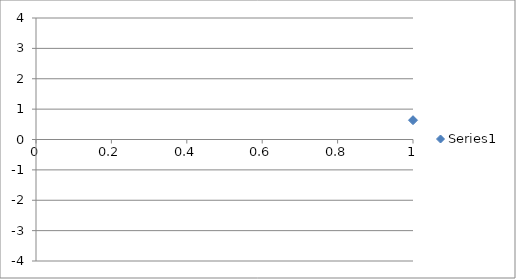
| Category | Series 0 |
|---|---|
| 0 | 0.636 |
| 1 | 1.004 |
| 2 | 1.754 |
| 3 | 1.162 |
| 4 | 0.38 |
| 5 | 0.19 |
| 6 | 0.744 |
| 7 | 0.642 |
| 8 | 0.556 |
| 9 | -1.528 |
| 10 | 0.773 |
| 11 | 0.345 |
| 12 | -0.09 |
| 13 | -1.63 |
| 14 | -0.12 |
| 15 | 1.317 |
| 16 | -0.302 |
| 17 | -0.511 |
| 18 | -0.824 |
| 19 | 0.758 |
| 20 | -1.618 |
| 21 | -1.153 |
| 22 | -0.097 |
| 23 | -0.929 |
| 24 | -1.388 |
| 25 | 0.124 |
| 26 | 0.292 |
| 27 | -0.352 |
| 28 | -0.188 |
| 29 | 0.951 |
| 30 | -0.192 |
| 31 | -0.151 |
| 32 | -0.055 |
| 33 | -0.922 |
| 34 | -0.14 |
| 35 | 0.74 |
| 36 | 0.985 |
| 37 | -0.102 |
| 38 | 1.831 |
| 39 | 2.6 |
| 40 | -1.301 |
| 41 | 1.106 |
| 42 | 1.1 |
| 43 | -0.743 |
| 44 | -0.687 |
| 45 | 1.255 |
| 46 | -0.95 |
| 47 | 0.716 |
| 48 | -0.32 |
| 49 | -0.008 |
| 50 | -0.055 |
| 51 | 1.253 |
| 52 | -1.075 |
| 53 | 0.085 |
| 54 | 1.781 |
| 55 | 0.334 |
| 56 | 1.335 |
| 57 | -0.453 |
| 58 | 1.046 |
| 59 | 1.041 |
| 60 | -1.469 |
| 61 | -1.563 |
| 62 | -1.487 |
| 63 | -0.041 |
| 64 | -1.183 |
| 65 | 0.853 |
| 66 | 0.687 |
| 67 | 1.001 |
| 68 | 2.039 |
| 69 | 0.221 |
| 70 | -0.11 |
| 71 | -0.748 |
| 72 | -0.691 |
| 73 | 0.623 |
| 74 | -0.919 |
| 75 | 0.859 |
| 76 | -1.227 |
| 77 | -1.481 |
| 78 | -0.417 |
| 79 | -0.263 |
| 80 | -1.396 |
| 81 | 0.132 |
| 82 | -0.255 |
| 83 | -1.609 |
| 84 | 0.15 |
| 85 | 0.907 |
| 86 | 0.197 |
| 87 | -1.43 |
| 88 | 0.295 |
| 89 | -0.295 |
| 90 | 0.592 |
| 91 | 0.621 |
| 92 | 1.332 |
| 93 | -0.735 |
| 94 | -0.095 |
| 95 | 0.132 |
| 96 | -0.966 |
| 97 | -1.987 |
| 98 | -1.743 |
| 99 | 1.02 |
| 100 | -1.786 |
| 101 | 0.338 |
| 102 | -0.488 |
| 103 | 0.171 |
| 104 | 0.37 |
| 105 | -0.263 |
| 106 | -0.118 |
| 107 | -1.39 |
| 108 | 1.619 |
| 109 | -1.267 |
| 110 | 0.516 |
| 111 | 0.038 |
| 112 | 0.138 |
| 113 | 0.534 |
| 114 | 1.021 |
| 115 | 1.615 |
| 116 | -0.571 |
| 117 | 0.055 |
| 118 | 1.013 |
| 119 | -1.171 |
| 120 | 2.258 |
| 121 | 0.608 |
| 122 | 0.284 |
| 123 | -0.651 |
| 124 | 0.113 |
| 125 | -1.273 |
| 126 | 0.331 |
| 127 | -0.769 |
| 128 | 0.218 |
| 129 | -0.839 |
| 130 | -2.6 |
| 131 | 1.495 |
| 132 | 1.664 |
| 133 | 1.42 |
| 134 | -2.346 |
| 135 | 2.022 |
| 136 | 0.514 |
| 137 | -1.801 |
| 138 | -0.22 |
| 139 | -1.171 |
| 140 | -2.464 |
| 141 | 0.643 |
| 142 | -1.412 |
| 143 | -0.602 |
| 144 | -0.132 |
| 145 | -0.176 |
| 146 | -1.171 |
| 147 | -2.078 |
| 148 | 1.425 |
| 149 | 0.823 |
| 150 | -0.168 |
| 151 | -0.37 |
| 152 | 0.514 |
| 153 | 0.623 |
| 154 | -0.508 |
| 155 | 1.054 |
| 156 | -1.273 |
| 157 | -0.816 |
| 158 | 2.498 |
| 159 | -1.097 |
| 160 | -0.382 |
| 161 | -0.391 |
| 162 | -0.734 |
| 163 | -0.191 |
| 164 | 0.071 |
| 165 | 0.16 |
| 166 | 1.787 |
| 167 | 0.031 |
| 168 | 0.01 |
| 169 | 1.586 |
| 170 | 1.677 |
| 171 | -2.298 |
| 172 | 0.529 |
| 173 | 0.052 |
| 174 | 0.661 |
| 175 | -0.114 |
| 176 | 2.003 |
| 177 | 1.588 |
| 178 | 2.389 |
| 179 | -0.483 |
| 180 | -0.35 |
| 181 | 1.161 |
| 182 | -1.422 |
| 183 | 0.794 |
| 184 | 1.311 |
| 185 | 0.668 |
| 186 | 0.13 |
| 187 | 1.175 |
| 188 | 0.527 |
| 189 | 0.395 |
| 190 | -0.325 |
| 191 | -2.051 |
| 192 | 0.967 |
| 193 | -0.158 |
| 194 | -1.124 |
| 195 | 0.899 |
| 196 | -2.179 |
| 197 | -0.427 |
| 198 | -0.76 |
| 199 | -0.748 |
| 200 | 0.466 |
| 201 | -1.677 |
| 202 | 0.28 |
| 203 | 1.351 |
| 204 | 1.813 |
| 205 | 0.981 |
| 206 | -0.238 |
| 207 | -0.477 |
| 208 | 1.499 |
| 209 | -2.084 |
| 210 | -0.81 |
| 211 | -0.631 |
| 212 | -0.935 |
| 213 | 0.399 |
| 214 | 0.593 |
| 215 | -0.768 |
| 216 | 1.464 |
| 217 | 0.864 |
| 218 | 0.46 |
| 219 | -1.216 |
| 220 | -0.871 |
| 221 | -1.001 |
| 222 | -0.981 |
| 223 | 0.219 |
| 224 | 0.718 |
| 225 | 0.72 |
| 226 | 0.767 |
| 227 | -1.277 |
| 228 | -0.524 |
| 229 | -1.149 |
| 230 | 0.254 |
| 231 | -0.725 |
| 232 | -1.225 |
| 233 | -0.191 |
| 234 | -0.658 |
| 235 | 2.303 |
| 236 | 1.016 |
| 237 | 0.725 |
| 238 | 0.884 |
| 239 | 0.383 |
| 240 | -0.843 |
| 241 | -0.511 |
| 242 | 1.061 |
| 243 | -1.405 |
| 244 | -0.489 |
| 245 | -2.108 |
| 246 | 1.776 |
| 247 | 0.545 |
| 248 | 0.215 |
| 249 | -1.826 |
| 250 | 1.623 |
| 251 | -0.181 |
| 252 | -1.742 |
| 253 | 0.225 |
| 254 | -0.684 |
| 255 | -0.558 |
| 256 | 0.657 |
| 257 | 0.295 |
| 258 | -3.498 |
| 259 | -0.484 |
| 260 | 1.65 |
| 261 | -1.843 |
| 262 | -0.39 |
| 263 | 1.313 |
| 264 | 0.255 |
| 265 | 0.62 |
| 266 | -0.535 |
| 267 | -1.008 |
| 268 | 0.234 |
| 269 | -0.999 |
| 270 | -1.965 |
| 271 | -0.904 |
| 272 | -1.455 |
| 273 | -0.423 |
| 274 | -0.92 |
| 275 | -1.669 |
| 276 | 0.528 |
| 277 | -1.024 |
| 278 | -0.737 |
| 279 | -0.082 |
| 280 | 0.236 |
| 281 | 0.435 |
| 282 | -0.113 |
| 283 | -1.369 |
| 284 | -1.853 |
| 285 | -0.391 |
| 286 | 1.927 |
| 287 | 0.558 |
| 288 | 0.398 |
| 289 | 0.492 |
| 290 | 0.477 |
| 291 | 0.324 |
| 292 | -0.543 |
| 293 | 0.835 |
| 294 | -0.704 |
| 295 | 0.899 |
| 296 | 0.463 |
| 297 | -0.148 |
| 298 | -2.052 |
| 299 | 0.541 |
| 300 | 0.33 |
| 301 | -0.406 |
| 302 | 0.679 |
| 303 | 0.31 |
| 304 | -0.434 |
| 305 | 0.054 |
| 306 | -0.38 |
| 307 | 1.592 |
| 308 | -0.382 |
| 309 | -0.359 |
| 310 | 0.246 |
| 311 | 0.485 |
| 312 | 0.087 |
| 313 | 0.737 |
| 314 | -1.364 |
| 315 | -0.78 |
| 316 | 0.317 |
| 317 | -0.613 |
| 318 | 0.53 |
| 319 | 0.06 |
| 320 | 0.025 |
| 321 | 0.621 |
| 322 | -0.165 |
| 323 | 1.648 |
| 324 | -2.081 |
| 325 | -0.154 |
| 326 | -0.542 |
| 327 | -1.93 |
| 328 | -0.229 |
| 329 | 1.05 |
| 330 | -2.26 |
| 331 | -0.87 |
| 332 | 1.669 |
| 333 | 0.655 |
| 334 | -0.165 |
| 335 | -1.778 |
| 336 | 0.731 |
| 337 | -2.17 |
| 338 | 2.318 |
| 339 | 0.13 |
| 340 | -2.49 |
| 341 | 1.225 |
| 342 | 0.879 |
| 343 | -0.617 |
| 344 | -0.047 |
| 345 | -1.167 |
| 346 | -1.747 |
| 347 | 1.923 |
| 348 | 0.456 |
| 349 | -0.348 |
| 350 | 0.828 |
| 351 | 1.072 |
| 352 | -0.516 |
| 353 | -0.657 |
| 354 | -1 |
| 355 | -2.768 |
| 356 | -0.135 |
| 357 | 1.284 |
| 358 | 1.03 |
| 359 | -1.036 |
| 360 | 1.513 |
| 361 | 0.221 |
| 362 | -0.398 |
| 363 | -1.006 |
| 364 | -1.751 |
| 365 | 1.952 |
| 366 | -0.78 |
| 367 | -0.89 |
| 368 | 0.203 |
| 369 | -0.065 |
| 370 | -0.365 |
| 371 | 0.533 |
| 372 | -0.071 |
| 373 | 1.216 |
| 374 | 0.547 |
| 375 | -0.631 |
| 376 | -2.058 |
| 377 | -0.34 |
| 378 | -0.256 |
| 379 | 1.099 |
| 380 | 2.069 |
| 381 | 0.585 |
| 382 | 0.456 |
| 383 | -0.649 |
| 384 | -2.37 |
| 385 | -0.732 |
| 386 | 1.275 |
| 387 | 0.384 |
| 388 | 0.193 |
| 389 | 1.289 |
| 390 | -0.119 |
| 391 | -0.206 |
| 392 | 0.802 |
| 393 | -0.787 |
| 394 | 0.753 |
| 395 | 0.943 |
| 396 | -0.707 |
| 397 | 0.627 |
| 398 | 0.973 |
| 399 | 0.491 |
| 400 | -0.893 |
| 401 | -0.241 |
| 402 | 1.309 |
| 403 | -0.139 |
| 404 | -1.401 |
| 405 | -0.517 |
| 406 | 0.183 |
| 407 | -0.039 |
| 408 | -0.446 |
| 409 | -1.891 |
| 410 | 0.854 |
| 411 | 0.813 |
| 412 | 0.415 |
| 413 | -0.11 |
| 414 | -0.516 |
| 415 | -0.27 |
| 416 | -0.905 |
| 417 | 1.341 |
| 418 | -1.512 |
| 419 | 0.622 |
| 420 | 0.627 |
| 421 | 1.223 |
| 422 | 0.907 |
| 423 | -0.131 |
| 424 | -1.139 |
| 425 | 0.099 |
| 426 | 0.542 |
| 427 | -0.982 |
| 428 | 1.253 |
| 429 | 0.701 |
| 430 | -0.22 |
| 431 | -0.928 |
| 432 | 0.278 |
| 433 | -0.487 |
| 434 | 0.085 |
| 435 | -2.616 |
| 436 | -0.75 |
| 437 | 1.967 |
| 438 | -0.952 |
| 439 | -0.325 |
| 440 | 0.474 |
| 441 | 0.99 |
| 442 | -0.541 |
| 443 | -1.412 |
| 444 | 2.036 |
| 445 | -0.674 |
| 446 | 1.059 |
| 447 | 0.716 |
| 448 | -1.067 |
| 449 | 1.237 |
| 450 | -0.809 |
| 451 | -0.49 |
| 452 | 1.066 |
| 453 | 0.431 |
| 454 | 0.065 |
| 455 | -0.075 |
| 456 | 0.995 |
| 457 | -0.228 |
| 458 | -0.848 |
| 459 | 1.333 |
| 460 | -0.368 |
| 461 | 0.501 |
| 462 | -0.442 |
| 463 | 0.112 |
| 464 | -1.488 |
| 465 | -0.365 |
| 466 | 1.268 |
| 467 | 0.272 |
| 468 | 0.771 |
| 469 | 1.018 |
| 470 | -0.285 |
| 471 | 0.263 |
| 472 | 1.426 |
| 473 | 0.084 |
| 474 | 1.622 |
| 475 | -0.054 |
| 476 | 0.402 |
| 477 | 0.439 |
| 478 | -1.168 |
| 479 | 0.576 |
| 480 | -0.02 |
| 481 | -0.869 |
| 482 | -0.166 |
| 483 | -0.809 |
| 484 | -0.666 |
| 485 | 0.743 |
| 486 | -1.605 |
| 487 | -0.902 |
| 488 | -0.546 |
| 489 | 2.044 |
| 490 | 0.224 |
| 491 | -0.33 |
| 492 | 0.028 |
| 493 | -1.039 |
| 494 | 0.616 |
| 495 | -0.687 |
| 496 | 1.159 |
| 497 | -1.69 |
| 498 | 0.258 |
| 499 | -1.38 |
| 500 | -1.994 |
| 501 | -1.224 |
| 502 | -0.116 |
| 503 | -0.716 |
| 504 | 0.583 |
| 505 | 0.325 |
| 506 | -0.929 |
| 507 | -2.248 |
| 508 | -1.448 |
| 509 | -1.368 |
| 510 | 0.075 |
| 511 | 0.496 |
| 512 | 0.481 |
| 513 | 1.391 |
| 514 | 0.625 |
| 515 | 1.103 |
| 516 | -1.241 |
| 517 | -0.045 |
| 518 | 0.549 |
| 519 | -1.495 |
| 520 | 0.644 |
| 521 | 0.647 |
| 522 | 0.614 |
| 523 | -0.272 |
| 524 | 0.443 |
| 525 | 0.211 |
| 526 | 0.356 |
| 527 | 0.717 |
| 528 | 1.743 |
| 529 | -0.383 |
| 530 | 0.328 |
| 531 | 0.878 |
| 532 | 0.16 |
| 533 | -1.504 |
| 534 | 0.661 |
| 535 | 1.058 |
| 536 | -0.026 |
| 537 | -0.866 |
| 538 | -1.189 |
| 539 | -0.161 |
| 540 | -0.072 |
| 541 | 0.586 |
| 542 | 0.259 |
| 543 | 2.102 |
| 544 | 1.284 |
| 545 | 0.49 |
| 546 | 1.962 |
| 547 | -0.149 |
| 548 | -1.301 |
| 549 | -0.831 |
| 550 | -0.2 |
| 551 | -0.371 |
| 552 | 0.109 |
| 553 | -0.982 |
| 554 | -1.414 |
| 555 | 0.976 |
| 556 | -2.493 |
| 557 | 0.378 |
| 558 | -0.347 |
| 559 | -2.13 |
| 560 | 1.235 |
| 561 | 0.214 |
| 562 | 0.428 |
| 563 | -1.183 |
| 564 | -0.481 |
| 565 | 1.105 |
| 566 | 0.628 |
| 567 | -0.022 |
| 568 | -0.749 |
| 569 | -0.471 |
| 570 | 0.025 |
| 571 | 1.253 |
| 572 | 0.123 |
| 573 | 0.259 |
| 574 | -1.26 |
| 575 | -0.106 |
| 576 | -0.214 |
| 577 | 0.717 |
| 578 | -1.052 |
| 579 | 0.013 |
| 580 | 0.791 |
| 581 | -0.551 |
| 582 | 0.451 |
| 583 | 0.059 |
| 584 | -0.634 |
| 585 | -0.768 |
| 586 | -1.561 |
| 587 | 0.221 |
| 588 | 1.126 |
| 589 | -1.222 |
| 590 | 1.598 |
| 591 | 2.454 |
| 592 | 0.791 |
| 593 | 1.602 |
| 594 | 1.519 |
| 595 | -0.737 |
| 596 | -0.134 |
| 597 | 1.447 |
| 598 | -1.196 |
| 599 | -1.374 |
| 600 | -0.769 |
| 601 | -0.156 |
| 602 | 0.184 |
| 603 | 0.985 |
| 604 | -1.263 |
| 605 | 0.687 |
| 606 | -0.526 |
| 607 | 0.687 |
| 608 | -1.532 |
| 609 | -0.639 |
| 610 | -1.498 |
| 611 | -1.224 |
| 612 | -0.795 |
| 613 | 0.221 |
| 614 | 2.761 |
| 615 | -0.88 |
| 616 | 0.337 |
| 617 | 0.061 |
| 618 | 0.046 |
| 619 | -0.519 |
| 620 | -0.142 |
| 621 | 0.23 |
| 622 | 0.284 |
| 623 | -0.607 |
| 624 | 0.418 |
| 625 | -0.195 |
| 626 | 1.428 |
| 627 | 0.223 |
| 628 | 0.621 |
| 629 | 0.643 |
| 630 | 0.5 |
| 631 | -0.385 |
| 632 | -0.518 |
| 633 | 2.178 |
| 634 | -0.627 |
| 635 | 0.419 |
| 636 | 0.89 |
| 637 | -1.297 |
| 638 | -0.86 |
| 639 | 0.057 |
| 640 | -0.293 |
| 641 | -0.925 |
| 642 | 0.624 |
| 643 | 1.561 |
| 644 | 1.771 |
| 645 | 0.22 |
| 646 | 2.231 |
| 647 | -0.258 |
| 648 | 0.102 |
| 649 | 0.747 |
| 650 | -2.376 |
| 651 | -0.356 |
| 652 | 0.894 |
| 653 | -0.505 |
| 654 | 2.299 |
| 655 | -2.116 |
| 656 | 0.15 |
| 657 | -0.191 |
| 658 | -0.694 |
| 659 | -0.515 |
| 660 | 0.05 |
| 661 | -0.258 |
| 662 | -0.487 |
| 663 | 0.414 |
| 664 | 0.928 |
| 665 | 0.446 |
| 666 | -1.57 |
| 667 | -0.712 |
| 668 | 1.332 |
| 669 | -0.06 |
| 670 | 0.826 |
| 671 | -0.295 |
| 672 | 1.497 |
| 673 | 0.358 |
| 674 | 1.953 |
| 675 | -0.021 |
| 676 | 0.794 |
| 677 | 1.834 |
| 678 | 0.518 |
| 679 | -0.548 |
| 680 | -0.989 |
| 681 | -0.331 |
| 682 | -2.014 |
| 683 | -0.762 |
| 684 | -0.264 |
| 685 | 0.499 |
| 686 | -0.046 |
| 687 | 1.179 |
| 688 | -0.036 |
| 689 | -1.368 |
| 690 | -0.917 |
| 691 | 1.028 |
| 692 | 0.73 |
| 693 | -0.133 |
| 694 | 2.336 |
| 695 | -0.822 |
| 696 | 0.134 |
| 697 | 1.648 |
| 698 | 0.876 |
| 699 | -0.272 |
| 700 | -0.113 |
| 701 | -0.124 |
| 702 | 0.975 |
| 703 | 0.034 |
| 704 | -0.82 |
| 705 | -1.957 |
| 706 | 0.251 |
| 707 | -0.535 |
| 708 | 1.463 |
| 709 | 1.512 |
| 710 | -1.887 |
| 711 | 0.115 |
| 712 | -0.806 |
| 713 | 1.335 |
| 714 | -0.9 |
| 715 | -0.404 |
| 716 | -1.52 |
| 717 | 0.074 |
| 718 | -1.239 |
| 719 | -1.872 |
| 720 | -0.615 |
| 721 | 1.127 |
| 722 | 0.903 |
| 723 | 0.462 |
| 724 | 0.169 |
| 725 | 0.093 |
| 726 | 0.911 |
| 727 | 0.15 |
| 728 | -0.226 |
| 729 | 1.181 |
| 730 | 0.873 |
| 731 | -2.506 |
| 732 | 0.003 |
| 733 | 1.591 |
| 734 | -0.834 |
| 735 | -0.728 |
| 736 | -0.115 |
| 737 | -0.768 |
| 738 | 0.995 |
| 739 | 0.006 |
| 740 | -1.219 |
| 741 | 2.722 |
| 742 | 0.342 |
| 743 | -1.334 |
| 744 | 0.187 |
| 745 | -0.084 |
| 746 | 0.932 |
| 747 | -1.488 |
| 748 | -0.231 |
| 749 | 0.93 |
| 750 | 0.96 |
| 751 | 0.558 |
| 752 | -1.99 |
| 753 | 1.212 |
| 754 | 0.666 |
| 755 | 0.033 |
| 756 | -0.279 |
| 757 | -0.609 |
| 758 | 0.159 |
| 759 | -2.217 |
| 760 | 0.023 |
| 761 | 0.082 |
| 762 | 0.221 |
| 763 | -0.82 |
| 764 | 0.725 |
| 765 | -1.332 |
| 766 | -1.208 |
| 767 | 1.328 |
| 768 | 0.407 |
| 769 | 0.852 |
| 770 | -1.011 |
| 771 | 0.779 |
| 772 | -0.303 |
| 773 | -0.287 |
| 774 | -0.338 |
| 775 | 1.307 |
| 776 | 0.462 |
| 777 | -0.276 |
| 778 | 0.212 |
| 779 | -0.099 |
| 780 | -0.803 |
| 781 | 0.519 |
| 782 | 1.504 |
| 783 | 1.458 |
| 784 | -0.064 |
| 785 | 0.457 |
| 786 | -1.061 |
| 787 | 1.407 |
| 788 | -1.14 |
| 789 | 1.898 |
| 790 | 0.172 |
| 791 | -1.196 |
| 792 | -0.726 |
| 793 | -0.035 |
| 794 | 0.698 |
| 795 | 0.726 |
| 796 | 0.425 |
| 797 | 0.105 |
| 798 | 0.121 |
| 799 | 0.012 |
| 800 | -0.022 |
| 801 | -0.773 |
| 802 | 1.663 |
| 803 | -0.587 |
| 804 | 0.217 |
| 805 | -1.977 |
| 806 | 0.481 |
| 807 | -0.149 |
| 808 | -2.287 |
| 809 | -1.121 |
| 810 | 1.526 |
| 811 | -1.193 |
| 812 | -1.01 |
| 813 | -0.738 |
| 814 | -0.177 |
| 815 | -1.053 |
| 816 | -0.608 |
| 817 | 0.668 |
| 818 | -0.867 |
| 819 | -0.733 |
| 820 | -0.323 |
| 821 | 0.314 |
| 822 | -0.817 |
| 823 | 1.632 |
| 824 | 1.233 |
| 825 | 0.473 |
| 826 | 1.902 |
| 827 | -1.084 |
| 828 | 1.01 |
| 829 | -1.514 |
| 830 | -1.084 |
| 831 | -0.866 |
| 832 | -1.013 |
| 833 | 0.942 |
| 834 | 0.459 |
| 835 | -1.075 |
| 836 | -0.3 |
| 837 | 1.213 |
| 838 | -0.744 |
| 839 | -0.503 |
| 840 | 0.368 |
| 841 | -0.043 |
| 842 | 0.904 |
| 843 | -1.216 |
| 844 | -1.273 |
| 845 | 0.036 |
| 846 | -0.932 |
| 847 | -0.192 |
| 848 | -0.682 |
| 849 | 1.975 |
| 850 | -0.068 |
| 851 | -1.199 |
| 852 | 0.165 |
| 853 | 0.609 |
| 854 | 0.361 |
| 855 | -0.304 |
| 856 | -0.474 |
| 857 | 0.672 |
| 858 | 0.259 |
| 859 | -2.512 |
| 860 | -0.009 |
| 861 | -0.92 |
| 862 | -0.949 |
| 863 | -0.19 |
| 864 | -0.222 |
| 865 | 0.235 |
| 866 | 0.194 |
| 867 | -2.035 |
| 868 | -0.234 |
| 869 | 0.202 |
| 870 | 1.997 |
| 871 | 0.018 |
| 872 | 0.316 |
| 873 | 0.619 |
| 874 | 0.749 |
| 875 | 0.1 |
| 876 | 1.794 |
| 877 | 1.166 |
| 878 | -0.513 |
| 879 | 0.099 |
| 880 | 0.241 |
| 881 | -0.459 |
| 882 | 1.133 |
| 883 | 0.755 |
| 884 | -0.628 |
| 885 | 1.476 |
| 886 | -1.135 |
| 887 | -0.739 |
| 888 | -1.164 |
| 889 | -1.63 |
| 890 | -0.028 |
| 891 | 1.378 |
| 892 | -1.406 |
| 893 | -1.039 |
| 894 | 0.549 |
| 895 | 1.606 |
| 896 | 1.175 |
| 897 | 0.939 |
| 898 | 0.397 |
| 899 | 0.255 |
| 900 | 0.26 |
| 901 | -1.175 |
| 902 | 0.497 |
| 903 | 0.233 |
| 904 | -0.173 |
| 905 | 0.693 |
| 906 | -0.033 |
| 907 | 0.477 |
| 908 | -1.075 |
| 909 | -1.23 |
| 910 | -1.065 |
| 911 | 1.107 |
| 912 | 1.926 |
| 913 | 0.095 |
| 914 | -0.612 |
| 915 | 0.338 |
| 916 | 1.045 |
| 917 | 0.367 |
| 918 | 0.515 |
| 919 | -0.586 |
| 920 | 0.223 |
| 921 | -1.252 |
| 922 | -1.579 |
| 923 | 0.316 |
| 924 | -0.293 |
| 925 | 0.121 |
| 926 | -0.771 |
| 927 | -0.279 |
| 928 | 0.122 |
| 929 | 0.527 |
| 930 | 0.114 |
| 931 | -0.735 |
| 932 | 0.72 |
| 933 | -0.45 |
| 934 | 2.39 |
| 935 | 0.184 |
| 936 | 0.706 |
| 937 | 0.149 |
| 938 | -2.924 |
| 939 | 1.176 |
| 940 | -0.011 |
| 941 | -1.508 |
| 942 | 0.041 |
| 943 | 0.969 |
| 944 | 0.394 |
| 945 | 1.896 |
| 946 | 0.284 |
| 947 | -1.857 |
| 948 | -0.602 |
| 949 | 1.337 |
| 950 | -0.363 |
| 951 | -1.293 |
| 952 | 0.41 |
| 953 | 1.337 |
| 954 | 2.052 |
| 955 | 1.712 |
| 956 | -0.606 |
| 957 | -0.929 |
| 958 | 0.509 |
| 959 | 0.756 |
| 960 | 0.25 |
| 961 | 0.793 |
| 962 | -1.011 |
| 963 | 0.3 |
| 964 | -2.727 |
| 965 | -0.813 |
| 966 | 0.852 |
| 967 | 1.643 |
| 968 | 1.286 |
| 969 | -1.446 |
| 970 | 1.394 |
| 971 | -0.2 |
| 972 | -0.297 |
| 973 | 0.271 |
| 974 | 1.174 |
| 975 | -1.723 |
| 976 | -2.008 |
| 977 | -0.563 |
| 978 | -0.175 |
| 979 | -1.082 |
| 980 | -0.888 |
| 981 | 0.224 |
| 982 | -0.55 |
| 983 | -1.97 |
| 984 | -0.331 |
| 985 | -0.708 |
| 986 | 0.645 |
| 987 | 0.891 |
| 988 | 1.827 |
| 989 | -0.128 |
| 990 | 0.213 |
| 991 | 0.319 |
| 992 | -1.793 |
| 993 | 0.577 |
| 994 | 1.393 |
| 995 | -0.444 |
| 996 | -0.154 |
| 997 | 0.951 |
| 998 | -0.827 |
| 999 | -2.286 |
| 1000 | 1.153 |